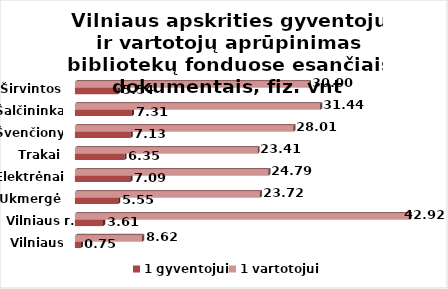
| Category | 1 gyventojui | 1 vartotojui |
|---|---|---|
| Vilniaus m. | 0.754 | 8.617 |
| Vilniaus r. | 3.605 | 42.918 |
| Ukmergė | 5.547 | 23.718 |
| Elektrėnai | 7.094 | 24.79 |
| Trakai | 6.345 | 23.409 |
| Švenčionys | 7.128 | 28.007 |
| Šalčininkai | 7.307 | 31.441 |
| Širvintos | 5.538 | 30 |